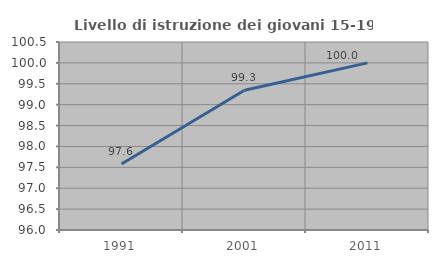
| Category | Livello di istruzione dei giovani 15-19 anni |
|---|---|
| 1991.0 | 97.581 |
| 2001.0 | 99.346 |
| 2011.0 | 100 |